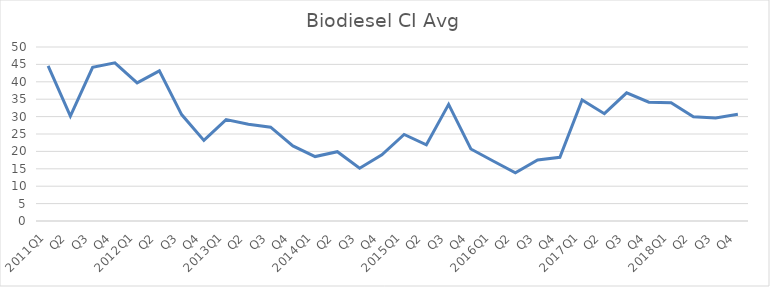
| Category | Series 0 |
|---|---|
| 2011Q1 | 44.57 |
| Q2 | 30.14 |
| Q3 | 44.16 |
| Q4 | 45.45 |
| 2012Q1 | 39.68 |
| Q2 | 43.15 |
| Q3 | 30.58 |
| Q4 | 23.16 |
| 2013Q1 | 29.14 |
| Q2 | 27.78 |
| Q3 | 26.97 |
| Q4 | 21.59 |
| 2014Q1 | 18.52 |
| Q2 | 19.91 |
| Q3 | 15.16 |
| Q4 | 19.04 |
| 2015Q1 | 24.88 |
| Q2 | 21.9 |
| Q3 | 33.51 |
| Q4 | 20.7 |
| 2016Q1 | 17.25 |
| Q2 | 13.83 |
| Q3 | 17.53 |
| Q4 | 18.31 |
| 2017Q1 | 34.76 |
| Q2 | 30.84 |
| Q3 | 36.82 |
| Q4 | 34.15 |
| 2018Q1 | 33.97 |
| Q2 | 29.93 |
| Q3 | 29.61 |
| Q4 | 30.67 |